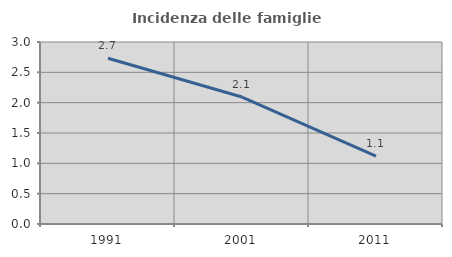
| Category | Incidenza delle famiglie numerose |
|---|---|
| 1991.0 | 2.731 |
| 2001.0 | 2.093 |
| 2011.0 | 1.119 |